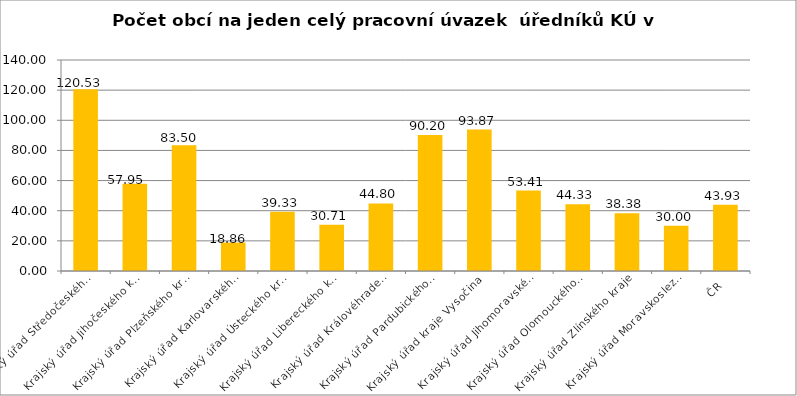
| Category | Počet obcí na jeden celý pracovní úvazek  úředníků KÚ |
|---|---|
| Krajský úřad Středočeského kraje | 120.53 |
| Krajský úřad Jihočeského kraje | 57.95 |
| Krajský úřad Plzeňského kraje | 83.5 |
| Krajský úřad Karlovarského kraje | 18.86 |
| Krajský úřad Ústeckého kraje | 39.33 |
| Krajský úřad Libereckého kraje | 30.71 |
| Krajský úřad Královéhradeckého kraje | 44.8 |
| Krajský úřad Pardubického kraje | 90.2 |
| Krajský úřad kraje Vysočina | 93.87 |
| Krajský úřad Jihomoravského kraje | 53.41 |
| Krajský úřad Olomouckého kraje | 44.33 |
| Krajský úřad Zlínského kraje | 38.38 |
| Krajský úřad Moravskoslezského kraje | 30 |
| ČR | 43.927 |